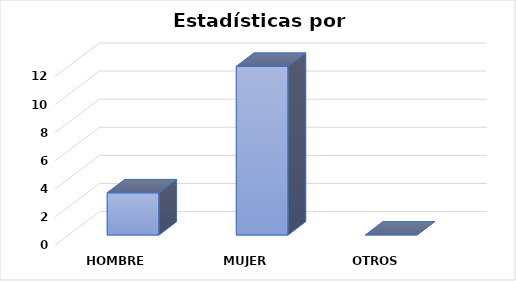
| Category | Series 0 |
|---|---|
| HOMBRE  | 3 |
| MUJER  | 12 |
| OTROS | 0 |